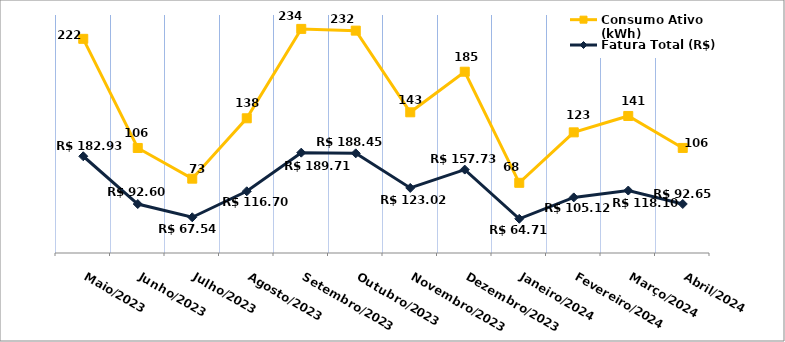
| Category | Fatura Total (R$) | Consumo Ativo (kWh) |
|---|---|---|
| Maio/2023 | 182.93 | 222 |
| Junho/2023 | 92.6 | 106 |
| Julho/2023 | 67.54 | 73 |
| Agosto/2023 | 116.7 | 138 |
| Setembro/2023 | 189.71 | 234 |
| Outubro/2023 | 188.45 | 232 |
| Novembro/2023 | 123.02 | 143 |
| Dezembro/2023 | 157.73 | 185 |
| Janeiro/2024 | 64.71 | 68 |
| Fevereiro/2024 | 105.12 | 123 |
| Março/2024 | 118.1 | 141 |
| Abril/2024 | 92.65 | 106 |